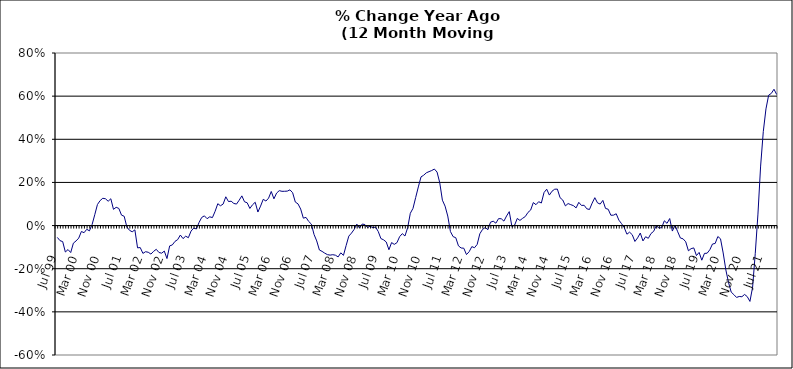
| Category | Series 0 |
|---|---|
| Jul 99 | -0.055 |
| Aug 99 | -0.07 |
| Sep 99 | -0.074 |
| Oct 99 | -0.123 |
| Nov 99 | -0.111 |
| Dec 99 | -0.125 |
| Jan 00 | -0.082 |
| Feb 00 | -0.071 |
| Mar 00 | -0.058 |
| Apr 00 | -0.027 |
| May 00 | -0.033 |
| Jun 00 | -0.017 |
| Jul 00 | -0.025 |
| Aug 00 | 0.005 |
| Sep 00 | 0.05 |
| Oct 00 | 0.098 |
| Nov 00 | 0.116 |
| Dec 00 | 0.127 |
| Jan 01 | 0.124 |
| Feb 01 | 0.113 |
| Mar 01 | 0.124 |
| Apr 01 | 0.075 |
| May 01 | 0.085 |
| Jun 01 | 0.08 |
| Jul 01 | 0.048 |
| Aug 01 | 0.043 |
| Sep 01 | -0.007 |
| Oct 01 | -0.022 |
| Nov 01 | -0.029 |
| Dec 01 | -0.02 |
| Jan 02 | -0.103 |
| Feb 02 | -0.102 |
| Mar 02 | -0.129 |
| Apr 02 | -0.121 |
| May 02 | -0.124 |
| Jun 02 | -0.132 |
| Jul 02 | -0.119 |
| Aug 02 | -0.11 |
| Sep 02 | -0.125 |
| Oct 02 | -0.128 |
| Nov 02 | -0.118 |
| Dec 02 | -0.153 |
| Jan 03 | -0.094 |
| Feb 03 | -0.09 |
| Mar 03 | -0.073 |
| Apr 03 | -0.065 |
| May 03 | -0.044 |
| Jun 03 | -0.06 |
| Jul 03 | -0.049 |
| Aug 03 | -0.056 |
| Sep 03 | -0.026 |
| Oct 03 | -0.012 |
| Nov 03 | -0.016 |
| Dec 03 | 0.014 |
| Jan 04 | 0.038 |
| Feb 04 | 0.045 |
| Mar 04 | 0.032 |
| Apr 04 | 0.041 |
| May 04 | 0.037 |
| Jun 04 | 0.066 |
| Jul 04 | 0.101 |
| Aug 04 | 0.092 |
| Sep 04 | 0.1 |
| Oct 04 | 0.133 |
| Nov 04 | 0.111 |
| Dec 04 | 0.113 |
| Jan 05 | 0.103 |
| Feb 05 | 0.1 |
| Mar 05 | 0.118 |
| Apr 05 | 0.138 |
| May 05 | 0.11 |
| Jun 05 | 0.106 |
| Jul 05 | 0.079 |
| Aug 05 | 0.097 |
| Sep 05 | 0.108 |
| Oct 05 | 0.063 |
| Nov 05 | 0.09 |
| Dec 05 | 0.122 |
| Jan 06 | 0.114 |
| Feb 06 | 0.127 |
| Mar 06 | 0.158 |
| Apr 06 | 0.124 |
| May 06 | 0.151 |
| Jun 06 | 0.162 |
| Jul 06 | 0.159 |
| Aug 06 | 0.159 |
| Sep 06 | 0.16 |
| Oct 06 | 0.166 |
| Nov 06 | 0.152 |
| Dec 06 | 0.109 |
| Jan 07 | 0.101 |
| Feb 07 | 0.076 |
| Mar 07 | 0.034 |
| Apr 07 | 0.038 |
| May 07 | 0.019 |
| Jun 07 | 0.007 |
| Jul 07 | -0.041 |
| Aug 07 | -0.071 |
| Sep 07 | -0.113 |
| Oct 07 | -0.12 |
| Nov 07 | -0.128 |
| Dec 07 | -0.135 |
| Jan 08 | -0.137 |
| Feb 08 | -0.135 |
| Mar 08 | -0.137 |
| Apr 08 | -0.145 |
| May 08 | -0.126 |
| Jun 08 | -0.138 |
| Jul 08 | -0.093 |
| Aug 08 | -0.049 |
| Sep-08 | -0.035 |
| Oct 08 | -0.018 |
| Nov 08 | 0.007 |
| Dec 08 | -0.011 |
| Jan 09 | 0.007 |
| Feb 09 | 0.005 |
| Mar 09 | -0.009 |
| Apr 09 | -0.003 |
| May 09 | -0.01 |
| Jun 09 | -0.007 |
| Jul 09 | -0.027 |
| Aug 09 | -0.06 |
| Sep 09 | -0.066 |
| Oct 09 | -0.076 |
| Nov 09 | -0.112 |
| Dec 09 | -0.079 |
| Jan 10 | -0.087 |
| Feb 10 | -0.079 |
| Mar 10 | -0.052 |
| Apr 10 | -0.037 |
| May 10 | -0.048 |
| Jun 10 | -0.01 |
| Jul 10 | 0.057 |
| Aug 10 | 0.08 |
| Sep 10 | 0.13 |
| Oct 10 | 0.179 |
| Nov 10 | 0.226 |
| Dec 10 | 0.233 |
| Jan 11 | 0.245 |
| Feb 11 | 0.25 |
| Mar 11 | 0.255 |
| Apr 11 | 0.262 |
| May 11 | 0.248 |
| Jun 11 | 0.199 |
| Jul 11 | 0.118 |
| Aug 11 | 0.09 |
| Sep 11 | 0.044 |
| Oct 11 | -0.028 |
| Nov 11 | -0.051 |
| Dec 11 | -0.056 |
| Jan 12 | -0.094 |
| Feb 12 | -0.104 |
| Mar 12 | -0.105 |
| Apr 12 | -0.134 |
| May 12 | -0.121 |
| Jun 12 | -0.098 |
| Jul 12 | -0.103 |
| Aug 12 | -0.087 |
| Sep 12 | -0.038 |
| Oct 12 | -0.018 |
| Nov 12 | -0.009 |
| Dec 12 | -0.019 |
| Jan 13 | 0.016 |
| Feb-13 | 0.02 |
| Mar-13 | 0.011 |
| Apr 13 | 0.032 |
| May 13 | 0.032 |
| Jun-13 | 0.021 |
| Jul 13 | 0.045 |
| Aug 13 | 0.065 |
| Sep 13 | -0.005 |
| Oct 13 | 0.002 |
| Nov 13 | 0.033 |
| Dec 13 | 0.024 |
| Jan 14 | 0.034 |
| Feb-14 | 0.042 |
| Mar 14 | 0.061 |
| Apr 14 | 0.072 |
| May 14 | 0.107 |
| Jun 14 | 0.097 |
| Jul-14 | 0.111 |
| Aug-14 | 0.105 |
| Sep 14 | 0.153 |
| Oct 14 | 0.169 |
| Nov 14 | 0.141 |
| Dec 14 | 0.159 |
| Jan 15 | 0.169 |
| Feb 15 | 0.169 |
| Mar 15 | 0.129 |
| Apr-15 | 0.118 |
| May 15 | 0.091 |
| Jun-15 | 0.102 |
| Jul 15 | 0.097 |
| Aug 15 | 0.092 |
| Sep 15 | 0.082 |
| Oct 15 | 0.108 |
| Nov 15 | 0.093 |
| Dec 15 | 0.094 |
| Jan 16 | 0.078 |
| Feb 16 | 0.075 |
| Mar 16 | 0.104 |
| Apr 16 | 0.129 |
| May 16 | 0.105 |
| Jun 16 | 0.1 |
| Jul 16 | 0.117 |
| Aug 16 | 0.08 |
| Sep 16 | 0.076 |
| Oct 16 | 0.048 |
| Nov 16 | 0.048 |
| Dec 16 | 0.055 |
| Jan 17 | 0.025 |
| Feb 17 | 0.009 |
| Mar 17 | -0.01 |
| Apr 17 | -0.04 |
| May 17 | -0.031 |
| Jun 17 | -0.042 |
| Jul 17 | -0.074 |
| Aug 17 | -0.057 |
| Sep 17 | -0.035 |
| Oct 17 | -0.071 |
| Nov 17 | -0.052 |
| Dec 17 | -0.059 |
| Jan 18 | -0.037 |
| Feb 18 | -0.027 |
| Mar 18 | 0 |
| Apr 18 | -0.012 |
| May 18 | -0.009 |
| Jun 18 | 0.022 |
| Jul 18 | 0.01 |
| Aug 18 | 0.033 |
| Sep 18 | -0.025 |
| Oct 18 | 0.002 |
| Nov 18 | -0.029 |
| Dec 18 | -0.058 |
| Jan 19 | -0.061 |
| Feb 19 | -0.075 |
| Mar 19 | -0.117 |
| Apr 19 | -0.107 |
| May 19 | -0.104 |
| Jun 19 | -0.139 |
| Jul 19 | -0.124 |
| Aug 19 | -0.16 |
| Sep 19 | -0.129 |
| Oct 19 | -0.128 |
| Nov 19 | -0.112 |
| Dec 19 | -0.085 |
| Jan 20 | -0.083 |
| Feb 20 | -0.051 |
| Mar 20 | -0.061 |
| Apr 20 | -0.127 |
| May 20 | -0.206 |
| Jun 20 | -0.264 |
| Jul 20 | -0.308 |
| Aug 20 | -0.32 |
| Sep 20 | -0.333 |
| Oct 20 | -0.329 |
| Nov 20 | -0.33 |
| Dec 20 | -0.319 |
| Jan 21 | -0.329 |
| Feb 21 | -0.352 |
| Mar 21 | -0.286 |
| Apr 21 | -0.129 |
| May 21 | 0.053 |
| Jun 21 | 0.276 |
| Jul 21 | 0.435 |
| Aug 21 | 0.541 |
| Sep 21 | 0.604 |
| Oct 21 | 0.613 |
| Nov 21 | 0.632 |
| Dec 21 | 0.608 |